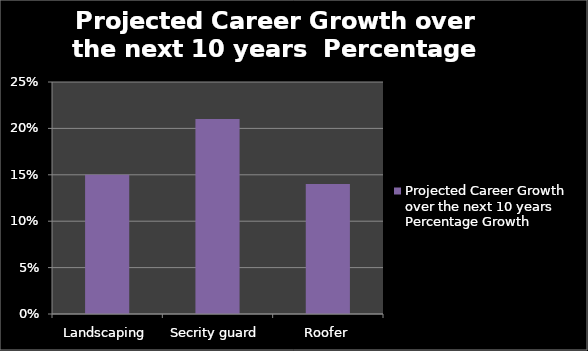
| Category | Projected Career Growth over the next 10 years Percentage Growth |
|---|---|
| Landscaping | 0.15 |
| Secrity guard | 0.21 |
| Roofer | 0.14 |